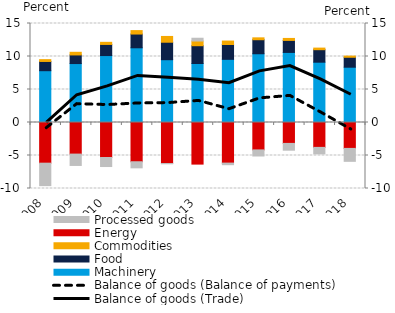
| Category | Machinery | Food | Commodities | Energy | Processed goods |
|---|---|---|---|---|---|
| 2008.0 | 7.848 | 1.4 | 0.277 | -6.162 | -3.406 |
| 2009.0 | 8.93 | 1.307 | 0.4 | -4.787 | -1.723 |
| 2010.0 | 10.143 | 1.685 | 0.319 | -5.299 | -1.373 |
| 2011.0 | 11.319 | 2.084 | 0.521 | -5.947 | -0.922 |
| 2012.0 | 9.515 | 2.649 | 0.875 | -6.214 | -0.043 |
| 2013.0 | 8.941 | 2.693 | 0.712 | -6.304 | 0.422 |
| 2014.0 | 9.569 | 2.25 | 0.521 | -6.153 | -0.241 |
| 2015.0 | 10.416 | 2.125 | 0.285 | -4.154 | -0.92 |
| 2016.0 | 10.619 | 1.818 | 0.301 | -3.168 | -1.03 |
| 2017.0 | 9.137 | 1.894 | 0.241 | -3.771 | -0.982 |
| 2018.0 | 8.377 | 1.505 | 0.179 | -3.925 | -1.961 |